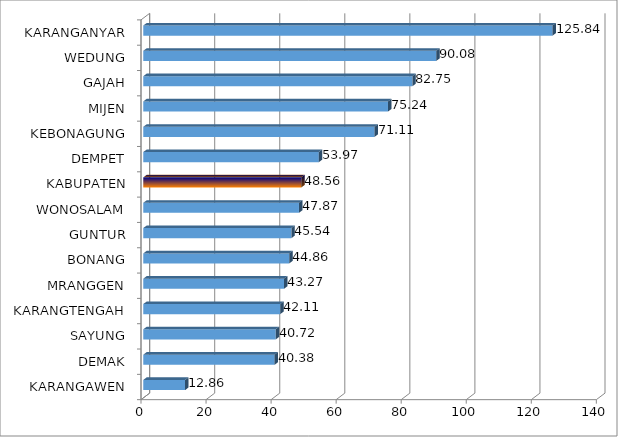
| Category | KARANGAWEN |
|---|---|
| KARANGAWEN | 12.86 |
| DEMAK | 40.38 |
| SAYUNG | 40.72 |
| KARANGTENGAH | 42.11 |
| MRANGGEN | 43.27 |
| BONANG | 44.86 |
| GUNTUR | 45.54 |
| WONOSALAM | 47.87 |
| KABUPATEN | 48.56 |
| DEMPET | 53.97 |
| KEBONAGUNG | 71.11 |
| MIJEN | 75.24 |
| GAJAH | 82.75 |
| WEDUNG | 90.08 |
| KARANGANYAR | 125.84 |